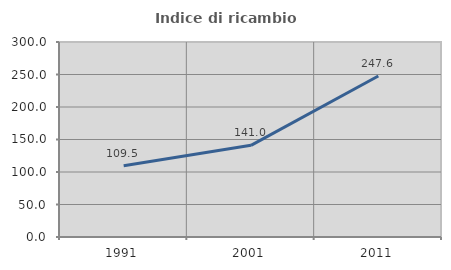
| Category | Indice di ricambio occupazionale  |
|---|---|
| 1991.0 | 109.524 |
| 2001.0 | 141.026 |
| 2011.0 | 247.619 |